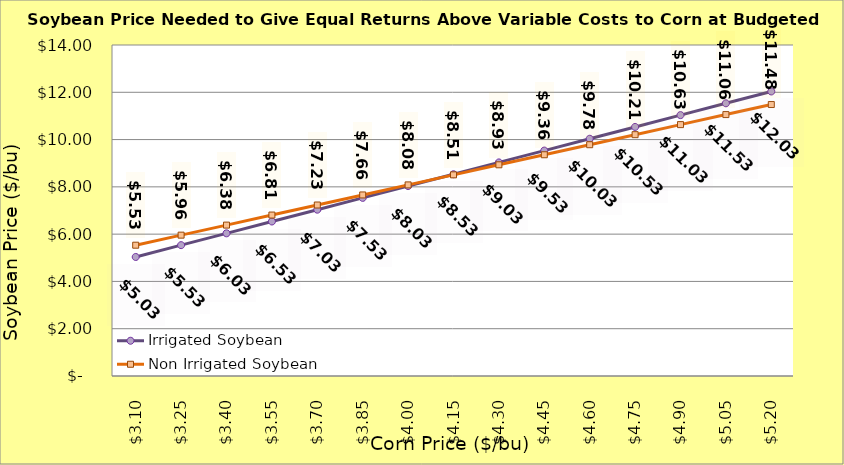
| Category | Irrigated Soybean | Non Irrigated Soybean |
|---|---|---|
| 3.1000000000000005 | 5.035 | 5.533 |
| 3.2500000000000004 | 5.535 | 5.958 |
| 3.4000000000000004 | 6.035 | 6.383 |
| 3.5500000000000003 | 6.535 | 6.808 |
| 3.7 | 7.035 | 7.233 |
| 3.85 | 7.535 | 7.658 |
| 4.0 | 8.035 | 8.083 |
| 4.15 | 8.535 | 8.508 |
| 4.300000000000001 | 9.035 | 8.933 |
| 4.450000000000001 | 9.535 | 9.358 |
| 4.600000000000001 | 10.035 | 9.783 |
| 4.750000000000002 | 10.535 | 10.208 |
| 4.900000000000002 | 11.035 | 10.633 |
| 5.0500000000000025 | 11.535 | 11.058 |
| 5.200000000000003 | 12.035 | 11.483 |